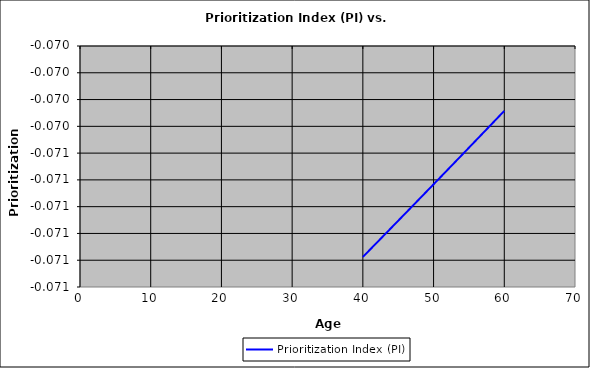
| Category | Prioritization Index (PI) |
|---|---|
| 40.0 | -0.071 |
| 41.0 | -0.071 |
| 42.0 | -0.071 |
| 43.0 | -0.071 |
| 44.0 | -0.071 |
| 45.0 | -0.071 |
| 46.0 | -0.071 |
| 47.0 | -0.071 |
| 48.0 | -0.071 |
| 49.0 | -0.071 |
| 50.0 | -0.071 |
| 51.0 | -0.071 |
| 52.0 | -0.071 |
| 53.0 | -0.071 |
| 54.0 | -0.071 |
| 55.0 | -0.07 |
| 56.0 | -0.07 |
| 57.0 | -0.07 |
| 58.0 | -0.07 |
| 59.0 | -0.07 |
| 60.0 | -0.07 |